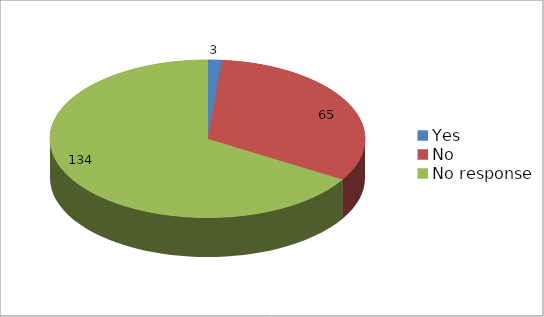
| Category | Series 0 |
|---|---|
| Yes | 3 |
| No | 65 |
| No response | 134 |